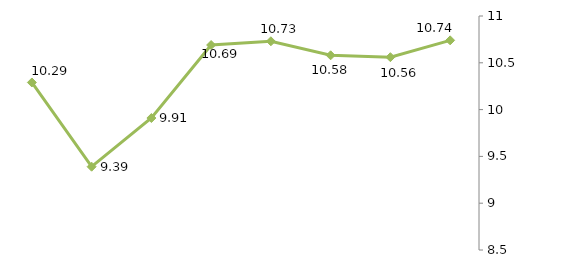
| Category | Средняя ставка |
|---|---|
| В Центральном ФО | 10.29 |
| В Северо-Западном ФО | 9.39 |
| В Северо-Кавказком ФО | 9.91 |
| В Дальневосточном ФО | 10.69 |
| В Южном ФО | 10.73 |
| В Приволжском ФО | 10.58 |
| В Уральском ФО | 10.56 |
| В Сибирском ФО | 10.74 |